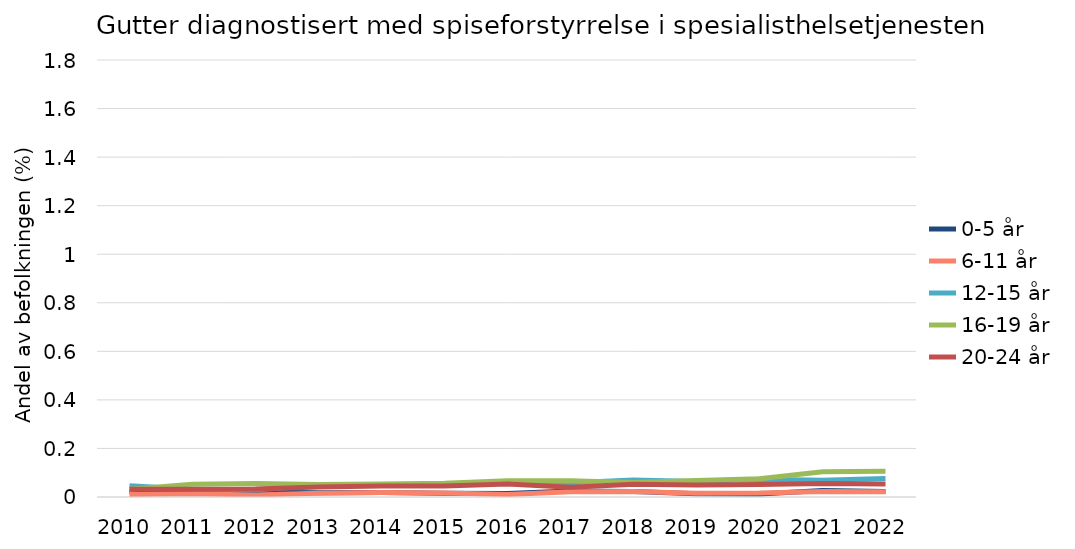
| Category | 0-5 år | 6-11 år | 12-15 år | 16-19 år | 20-24 år |
|---|---|---|---|---|---|
| 2010.0 | 0.023 | 0.011 | 0.046 | 0.032 | 0.032 |
| 2011.0 | 0.018 | 0.013 | 0.032 | 0.053 | 0.032 |
| 2012.0 | 0.019 | 0.009 | 0.03 | 0.055 | 0.033 |
| 2013.0 | 0.018 | 0.016 | 0.046 | 0.051 | 0.042 |
| 2014.0 | 0.019 | 0.019 | 0.051 | 0.053 | 0.046 |
| 2015.0 | 0.015 | 0.016 | 0.051 | 0.056 | 0.046 |
| 2016.0 | 0.014 | 0.01 | 0.055 | 0.067 | 0.053 |
| 2017.0 | 0.024 | 0.022 | 0.058 | 0.067 | 0.041 |
| 2018.0 | 0.023 | 0.023 | 0.07 | 0.06 | 0.053 |
| 2019.0 | 0.013 | 0.015 | 0.064 | 0.068 | 0.049 |
| 2020.0 | 0.012 | 0.016 | 0.073 | 0.075 | 0.052 |
| 2021.0 | 0.027 | 0.023 | 0.069 | 0.104 | 0.055 |
| 2022.0 | 0.023 | 0.022 | 0.076 | 0.106 | 0.053 |